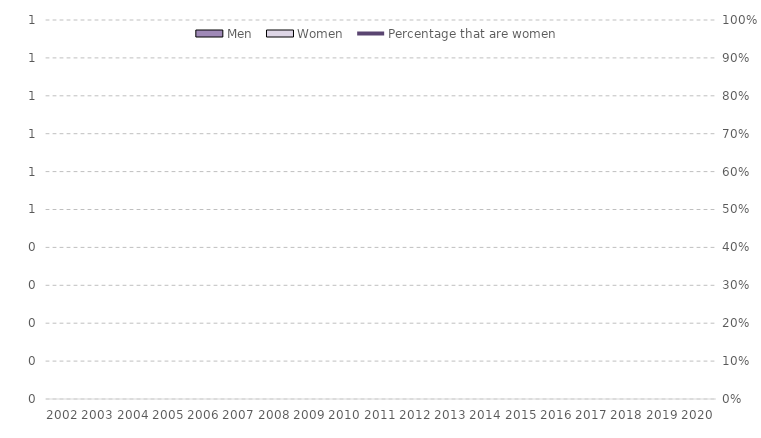
| Category | Men | Women |
|---|---|---|
| 2002.0 | 0 | 0 |
| 2003.0 | 0 | 0 |
| 2004.0 | 0 | 0 |
| 2005.0 | 0 | 0 |
| 2006.0 | 0 | 0 |
| 2007.0 | 0 | 0 |
| 2008.0 | 0 | 0 |
| 2009.0 | 0 | 0 |
| 2010.0 | 0 | 0 |
| 2011.0 | 0 | 0 |
| 2012.0 | 0 | 0 |
| 2013.0 | 0 | 0 |
| 2014.0 | 0 | 0 |
| 2015.0 | 0 | 0 |
| 2016.0 | 0 | 0 |
| 2017.0 | 0 | 0 |
| 2018.0 | 0 | 0 |
| 2019.0 | 0 | 0 |
| 2020.0 | 0 | 0 |